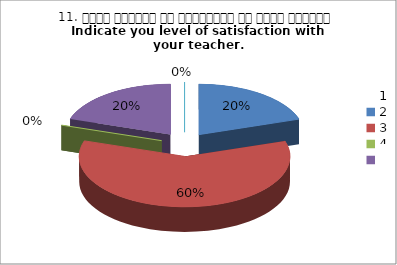
| Category | 11. अपने शिक्षक से संतुष्टि का स्तर बताइये
Indicate you level of satisfaction with your teacher.
 |
|---|---|
| 0 | 1 |
| 1 | 3 |
| 2 | 0 |
| 3 | 1 |
| 4 | 0 |